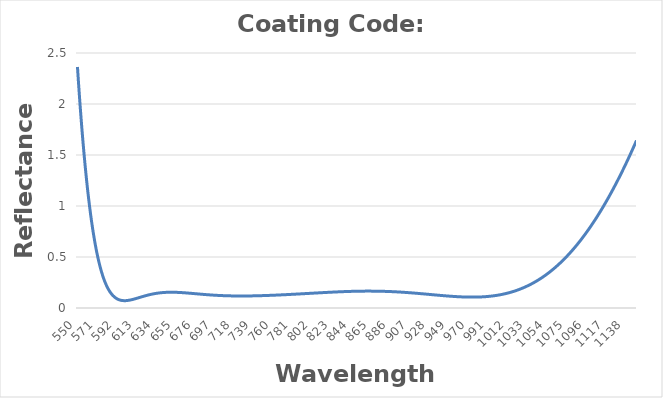
| Category | Reflectance |
|---|---|
| 550.0 | 2.363 |
| 551.0 | 2.225 |
| 552.0 | 2.092 |
| 553.0 | 1.965 |
| 554.0 | 1.845 |
| 555.0 | 1.73 |
| 556.0 | 1.62 |
| 557.0 | 1.516 |
| 558.0 | 1.418 |
| 559.0 | 1.324 |
| 560.0 | 1.235 |
| 561.0 | 1.151 |
| 562.0 | 1.071 |
| 563.0 | 0.996 |
| 564.0 | 0.925 |
| 565.0 | 0.858 |
| 566.0 | 0.795 |
| 567.0 | 0.736 |
| 568.0 | 0.68 |
| 569.0 | 0.628 |
| 570.0 | 0.579 |
| 571.0 | 0.534 |
| 572.0 | 0.491 |
| 573.0 | 0.452 |
| 574.0 | 0.415 |
| 575.0 | 0.38 |
| 576.0 | 0.349 |
| 577.0 | 0.319 |
| 578.0 | 0.292 |
| 579.0 | 0.267 |
| 580.0 | 0.244 |
| 581.0 | 0.223 |
| 582.0 | 0.204 |
| 583.0 | 0.187 |
| 584.0 | 0.171 |
| 585.0 | 0.157 |
| 586.0 | 0.144 |
| 587.0 | 0.132 |
| 588.0 | 0.122 |
| 589.0 | 0.113 |
| 590.0 | 0.105 |
| 591.0 | 0.098 |
| 592.0 | 0.092 |
| 593.0 | 0.087 |
| 594.0 | 0.083 |
| 595.0 | 0.08 |
| 596.0 | 0.077 |
| 597.0 | 0.075 |
| 598.0 | 0.073 |
| 599.0 | 0.072 |
| 600.0 | 0.072 |
| 601.0 | 0.072 |
| 602.0 | 0.072 |
| 603.0 | 0.073 |
| 604.0 | 0.074 |
| 605.0 | 0.075 |
| 606.0 | 0.077 |
| 607.0 | 0.079 |
| 608.0 | 0.081 |
| 609.0 | 0.083 |
| 610.0 | 0.086 |
| 611.0 | 0.088 |
| 612.0 | 0.091 |
| 613.0 | 0.093 |
| 614.0 | 0.096 |
| 615.0 | 0.099 |
| 616.0 | 0.101 |
| 617.0 | 0.104 |
| 618.0 | 0.107 |
| 619.0 | 0.11 |
| 620.0 | 0.112 |
| 621.0 | 0.115 |
| 622.0 | 0.118 |
| 623.0 | 0.12 |
| 624.0 | 0.123 |
| 625.0 | 0.125 |
| 626.0 | 0.128 |
| 627.0 | 0.13 |
| 628.0 | 0.132 |
| 629.0 | 0.134 |
| 630.0 | 0.136 |
| 631.0 | 0.138 |
| 632.0 | 0.14 |
| 633.0 | 0.141 |
| 634.0 | 0.143 |
| 635.0 | 0.144 |
| 636.0 | 0.146 |
| 637.0 | 0.147 |
| 638.0 | 0.148 |
| 639.0 | 0.149 |
| 640.0 | 0.15 |
| 641.0 | 0.151 |
| 642.0 | 0.152 |
| 643.0 | 0.152 |
| 644.0 | 0.153 |
| 645.0 | 0.153 |
| 646.0 | 0.154 |
| 647.0 | 0.154 |
| 648.0 | 0.154 |
| 649.0 | 0.154 |
| 650.0 | 0.154 |
| 651.0 | 0.154 |
| 652.0 | 0.154 |
| 653.0 | 0.154 |
| 654.0 | 0.154 |
| 655.0 | 0.154 |
| 656.0 | 0.154 |
| 657.0 | 0.153 |
| 658.0 | 0.153 |
| 659.0 | 0.152 |
| 660.0 | 0.152 |
| 661.0 | 0.151 |
| 662.0 | 0.151 |
| 663.0 | 0.15 |
| 664.0 | 0.15 |
| 665.0 | 0.149 |
| 666.0 | 0.148 |
| 667.0 | 0.148 |
| 668.0 | 0.147 |
| 669.0 | 0.146 |
| 670.0 | 0.145 |
| 671.0 | 0.145 |
| 672.0 | 0.144 |
| 673.0 | 0.143 |
| 674.0 | 0.142 |
| 675.0 | 0.141 |
| 676.0 | 0.141 |
| 677.0 | 0.14 |
| 678.0 | 0.139 |
| 679.0 | 0.138 |
| 680.0 | 0.137 |
| 681.0 | 0.137 |
| 682.0 | 0.136 |
| 683.0 | 0.135 |
| 684.0 | 0.134 |
| 685.0 | 0.134 |
| 686.0 | 0.133 |
| 687.0 | 0.132 |
| 688.0 | 0.131 |
| 689.0 | 0.131 |
| 690.0 | 0.13 |
| 691.0 | 0.129 |
| 692.0 | 0.128 |
| 693.0 | 0.128 |
| 694.0 | 0.127 |
| 695.0 | 0.127 |
| 696.0 | 0.126 |
| 697.0 | 0.126 |
| 698.0 | 0.125 |
| 699.0 | 0.124 |
| 700.0 | 0.124 |
| 701.0 | 0.123 |
| 702.0 | 0.123 |
| 703.0 | 0.122 |
| 704.0 | 0.122 |
| 705.0 | 0.122 |
| 706.0 | 0.121 |
| 707.0 | 0.121 |
| 708.0 | 0.121 |
| 709.0 | 0.12 |
| 710.0 | 0.12 |
| 711.0 | 0.12 |
| 712.0 | 0.12 |
| 713.0 | 0.119 |
| 714.0 | 0.119 |
| 715.0 | 0.119 |
| 716.0 | 0.119 |
| 717.0 | 0.118 |
| 718.0 | 0.118 |
| 719.0 | 0.118 |
| 720.0 | 0.118 |
| 721.0 | 0.118 |
| 722.0 | 0.118 |
| 723.0 | 0.118 |
| 724.0 | 0.118 |
| 725.0 | 0.118 |
| 726.0 | 0.118 |
| 727.0 | 0.118 |
| 728.0 | 0.118 |
| 729.0 | 0.118 |
| 730.0 | 0.118 |
| 731.0 | 0.118 |
| 732.0 | 0.118 |
| 733.0 | 0.118 |
| 734.0 | 0.118 |
| 735.0 | 0.118 |
| 736.0 | 0.119 |
| 737.0 | 0.119 |
| 738.0 | 0.119 |
| 739.0 | 0.119 |
| 740.0 | 0.119 |
| 741.0 | 0.12 |
| 742.0 | 0.12 |
| 743.0 | 0.12 |
| 744.0 | 0.12 |
| 745.0 | 0.12 |
| 746.0 | 0.121 |
| 747.0 | 0.121 |
| 748.0 | 0.121 |
| 749.0 | 0.122 |
| 750.0 | 0.122 |
| 751.0 | 0.122 |
| 752.0 | 0.122 |
| 753.0 | 0.123 |
| 754.0 | 0.123 |
| 755.0 | 0.123 |
| 756.0 | 0.124 |
| 757.0 | 0.124 |
| 758.0 | 0.124 |
| 759.0 | 0.125 |
| 760.0 | 0.125 |
| 761.0 | 0.126 |
| 762.0 | 0.126 |
| 763.0 | 0.126 |
| 764.0 | 0.127 |
| 765.0 | 0.127 |
| 766.0 | 0.128 |
| 767.0 | 0.128 |
| 768.0 | 0.128 |
| 769.0 | 0.129 |
| 770.0 | 0.129 |
| 771.0 | 0.13 |
| 772.0 | 0.13 |
| 773.0 | 0.131 |
| 774.0 | 0.131 |
| 775.0 | 0.132 |
| 776.0 | 0.132 |
| 777.0 | 0.132 |
| 778.0 | 0.133 |
| 779.0 | 0.133 |
| 780.0 | 0.134 |
| 781.0 | 0.134 |
| 782.0 | 0.135 |
| 783.0 | 0.135 |
| 784.0 | 0.136 |
| 785.0 | 0.136 |
| 786.0 | 0.137 |
| 787.0 | 0.137 |
| 788.0 | 0.138 |
| 789.0 | 0.138 |
| 790.0 | 0.139 |
| 791.0 | 0.139 |
| 792.0 | 0.14 |
| 793.0 | 0.14 |
| 794.0 | 0.141 |
| 795.0 | 0.141 |
| 796.0 | 0.142 |
| 797.0 | 0.142 |
| 798.0 | 0.143 |
| 799.0 | 0.143 |
| 800.0 | 0.144 |
| 801.0 | 0.144 |
| 802.0 | 0.145 |
| 803.0 | 0.146 |
| 804.0 | 0.146 |
| 805.0 | 0.146 |
| 806.0 | 0.147 |
| 807.0 | 0.148 |
| 808.0 | 0.148 |
| 809.0 | 0.149 |
| 810.0 | 0.149 |
| 811.0 | 0.15 |
| 812.0 | 0.15 |
| 813.0 | 0.151 |
| 814.0 | 0.151 |
| 815.0 | 0.152 |
| 816.0 | 0.152 |
| 817.0 | 0.152 |
| 818.0 | 0.153 |
| 819.0 | 0.154 |
| 820.0 | 0.154 |
| 821.0 | 0.154 |
| 822.0 | 0.155 |
| 823.0 | 0.155 |
| 824.0 | 0.156 |
| 825.0 | 0.156 |
| 826.0 | 0.157 |
| 827.0 | 0.157 |
| 828.0 | 0.158 |
| 829.0 | 0.158 |
| 830.0 | 0.158 |
| 831.0 | 0.159 |
| 832.0 | 0.159 |
| 833.0 | 0.16 |
| 834.0 | 0.16 |
| 835.0 | 0.16 |
| 836.0 | 0.161 |
| 837.0 | 0.161 |
| 838.0 | 0.161 |
| 839.0 | 0.162 |
| 840.0 | 0.162 |
| 841.0 | 0.162 |
| 842.0 | 0.162 |
| 843.0 | 0.163 |
| 844.0 | 0.163 |
| 845.0 | 0.163 |
| 846.0 | 0.164 |
| 847.0 | 0.164 |
| 848.0 | 0.164 |
| 849.0 | 0.164 |
| 850.0 | 0.164 |
| 851.0 | 0.164 |
| 852.0 | 0.165 |
| 853.0 | 0.165 |
| 854.0 | 0.165 |
| 855.0 | 0.165 |
| 856.0 | 0.165 |
| 857.0 | 0.165 |
| 858.0 | 0.165 |
| 859.0 | 0.165 |
| 860.0 | 0.166 |
| 861.0 | 0.166 |
| 862.0 | 0.166 |
| 863.0 | 0.166 |
| 864.0 | 0.166 |
| 865.0 | 0.166 |
| 866.0 | 0.165 |
| 867.0 | 0.165 |
| 868.0 | 0.165 |
| 869.0 | 0.165 |
| 870.0 | 0.165 |
| 871.0 | 0.165 |
| 872.0 | 0.165 |
| 873.0 | 0.165 |
| 874.0 | 0.164 |
| 875.0 | 0.164 |
| 876.0 | 0.164 |
| 877.0 | 0.164 |
| 878.0 | 0.164 |
| 879.0 | 0.163 |
| 880.0 | 0.163 |
| 881.0 | 0.163 |
| 882.0 | 0.162 |
| 883.0 | 0.162 |
| 884.0 | 0.162 |
| 885.0 | 0.161 |
| 886.0 | 0.161 |
| 887.0 | 0.161 |
| 888.0 | 0.16 |
| 889.0 | 0.16 |
| 890.0 | 0.159 |
| 891.0 | 0.159 |
| 892.0 | 0.158 |
| 893.0 | 0.158 |
| 894.0 | 0.157 |
| 895.0 | 0.157 |
| 896.0 | 0.156 |
| 897.0 | 0.156 |
| 898.0 | 0.155 |
| 899.0 | 0.155 |
| 900.0 | 0.154 |
| 901.0 | 0.153 |
| 902.0 | 0.153 |
| 903.0 | 0.152 |
| 904.0 | 0.151 |
| 905.0 | 0.151 |
| 906.0 | 0.15 |
| 907.0 | 0.149 |
| 908.0 | 0.149 |
| 909.0 | 0.148 |
| 910.0 | 0.147 |
| 911.0 | 0.146 |
| 912.0 | 0.146 |
| 913.0 | 0.145 |
| 914.0 | 0.144 |
| 915.0 | 0.144 |
| 916.0 | 0.143 |
| 917.0 | 0.142 |
| 918.0 | 0.141 |
| 919.0 | 0.14 |
| 920.0 | 0.14 |
| 921.0 | 0.139 |
| 922.0 | 0.138 |
| 923.0 | 0.137 |
| 924.0 | 0.136 |
| 925.0 | 0.135 |
| 926.0 | 0.135 |
| 927.0 | 0.134 |
| 928.0 | 0.133 |
| 929.0 | 0.132 |
| 930.0 | 0.131 |
| 931.0 | 0.13 |
| 932.0 | 0.13 |
| 933.0 | 0.129 |
| 934.0 | 0.128 |
| 935.0 | 0.127 |
| 936.0 | 0.126 |
| 937.0 | 0.126 |
| 938.0 | 0.125 |
| 939.0 | 0.124 |
| 940.0 | 0.123 |
| 941.0 | 0.122 |
| 942.0 | 0.122 |
| 943.0 | 0.121 |
| 944.0 | 0.12 |
| 945.0 | 0.119 |
| 946.0 | 0.118 |
| 947.0 | 0.118 |
| 948.0 | 0.117 |
| 949.0 | 0.116 |
| 950.0 | 0.116 |
| 951.0 | 0.115 |
| 952.0 | 0.114 |
| 953.0 | 0.114 |
| 954.0 | 0.113 |
| 955.0 | 0.113 |
| 956.0 | 0.112 |
| 957.0 | 0.111 |
| 958.0 | 0.111 |
| 959.0 | 0.11 |
| 960.0 | 0.11 |
| 961.0 | 0.11 |
| 962.0 | 0.109 |
| 963.0 | 0.109 |
| 964.0 | 0.108 |
| 965.0 | 0.108 |
| 966.0 | 0.108 |
| 967.0 | 0.108 |
| 968.0 | 0.107 |
| 969.0 | 0.107 |
| 970.0 | 0.107 |
| 971.0 | 0.107 |
| 972.0 | 0.107 |
| 973.0 | 0.107 |
| 974.0 | 0.107 |
| 975.0 | 0.107 |
| 976.0 | 0.107 |
| 977.0 | 0.107 |
| 978.0 | 0.107 |
| 979.0 | 0.107 |
| 980.0 | 0.108 |
| 981.0 | 0.108 |
| 982.0 | 0.108 |
| 983.0 | 0.108 |
| 984.0 | 0.109 |
| 985.0 | 0.11 |
| 986.0 | 0.11 |
| 987.0 | 0.111 |
| 988.0 | 0.111 |
| 989.0 | 0.112 |
| 990.0 | 0.113 |
| 991.0 | 0.114 |
| 992.0 | 0.115 |
| 993.0 | 0.116 |
| 994.0 | 0.117 |
| 995.0 | 0.118 |
| 996.0 | 0.119 |
| 997.0 | 0.12 |
| 998.0 | 0.121 |
| 999.0 | 0.123 |
| 1000.0 | 0.124 |
| 1001.0 | 0.126 |
| 1002.0 | 0.127 |
| 1003.0 | 0.129 |
| 1004.0 | 0.13 |
| 1005.0 | 0.132 |
| 1006.0 | 0.134 |
| 1007.0 | 0.136 |
| 1008.0 | 0.138 |
| 1009.0 | 0.14 |
| 1010.0 | 0.142 |
| 1011.0 | 0.144 |
| 1012.0 | 0.147 |
| 1013.0 | 0.149 |
| 1014.0 | 0.152 |
| 1015.0 | 0.154 |
| 1016.0 | 0.157 |
| 1017.0 | 0.16 |
| 1018.0 | 0.163 |
| 1019.0 | 0.166 |
| 1020.0 | 0.169 |
| 1021.0 | 0.172 |
| 1022.0 | 0.175 |
| 1023.0 | 0.178 |
| 1024.0 | 0.182 |
| 1025.0 | 0.185 |
| 1026.0 | 0.189 |
| 1027.0 | 0.192 |
| 1028.0 | 0.196 |
| 1029.0 | 0.2 |
| 1030.0 | 0.204 |
| 1031.0 | 0.208 |
| 1032.0 | 0.212 |
| 1033.0 | 0.217 |
| 1034.0 | 0.221 |
| 1035.0 | 0.226 |
| 1036.0 | 0.23 |
| 1037.0 | 0.235 |
| 1038.0 | 0.24 |
| 1039.0 | 0.245 |
| 1040.0 | 0.25 |
| 1041.0 | 0.255 |
| 1042.0 | 0.26 |
| 1043.0 | 0.266 |
| 1044.0 | 0.271 |
| 1045.0 | 0.277 |
| 1046.0 | 0.283 |
| 1047.0 | 0.289 |
| 1048.0 | 0.295 |
| 1049.0 | 0.301 |
| 1050.0 | 0.307 |
| 1051.0 | 0.313 |
| 1052.0 | 0.32 |
| 1053.0 | 0.326 |
| 1054.0 | 0.333 |
| 1055.0 | 0.34 |
| 1056.0 | 0.347 |
| 1057.0 | 0.354 |
| 1058.0 | 0.361 |
| 1059.0 | 0.369 |
| 1060.0 | 0.376 |
| 1061.0 | 0.384 |
| 1062.0 | 0.392 |
| 1063.0 | 0.4 |
| 1064.0 | 0.408 |
| 1065.0 | 0.416 |
| 1066.0 | 0.424 |
| 1067.0 | 0.432 |
| 1068.0 | 0.441 |
| 1069.0 | 0.45 |
| 1070.0 | 0.458 |
| 1071.0 | 0.467 |
| 1072.0 | 0.476 |
| 1073.0 | 0.486 |
| 1074.0 | 0.495 |
| 1075.0 | 0.505 |
| 1076.0 | 0.514 |
| 1077.0 | 0.524 |
| 1078.0 | 0.534 |
| 1079.0 | 0.544 |
| 1080.0 | 0.554 |
| 1081.0 | 0.565 |
| 1082.0 | 0.575 |
| 1083.0 | 0.586 |
| 1084.0 | 0.597 |
| 1085.0 | 0.608 |
| 1086.0 | 0.619 |
| 1087.0 | 0.63 |
| 1088.0 | 0.641 |
| 1089.0 | 0.653 |
| 1090.0 | 0.664 |
| 1091.0 | 0.676 |
| 1092.0 | 0.688 |
| 1093.0 | 0.7 |
| 1094.0 | 0.713 |
| 1095.0 | 0.725 |
| 1096.0 | 0.738 |
| 1097.0 | 0.75 |
| 1098.0 | 0.763 |
| 1099.0 | 0.776 |
| 1100.0 | 0.789 |
| 1101.0 | 0.803 |
| 1102.0 | 0.816 |
| 1103.0 | 0.83 |
| 1104.0 | 0.844 |
| 1105.0 | 0.857 |
| 1106.0 | 0.872 |
| 1107.0 | 0.886 |
| 1108.0 | 0.9 |
| 1109.0 | 0.915 |
| 1110.0 | 0.929 |
| 1111.0 | 0.944 |
| 1112.0 | 0.959 |
| 1113.0 | 0.974 |
| 1114.0 | 0.99 |
| 1115.0 | 1.005 |
| 1116.0 | 1.021 |
| 1117.0 | 1.036 |
| 1118.0 | 1.052 |
| 1119.0 | 1.068 |
| 1120.0 | 1.085 |
| 1121.0 | 1.101 |
| 1122.0 | 1.118 |
| 1123.0 | 1.134 |
| 1124.0 | 1.151 |
| 1125.0 | 1.168 |
| 1126.0 | 1.185 |
| 1127.0 | 1.202 |
| 1128.0 | 1.22 |
| 1129.0 | 1.238 |
| 1130.0 | 1.255 |
| 1131.0 | 1.273 |
| 1132.0 | 1.291 |
| 1133.0 | 1.31 |
| 1134.0 | 1.328 |
| 1135.0 | 1.346 |
| 1136.0 | 1.365 |
| 1137.0 | 1.384 |
| 1138.0 | 1.403 |
| 1139.0 | 1.422 |
| 1140.0 | 1.441 |
| 1141.0 | 1.461 |
| 1142.0 | 1.48 |
| 1143.0 | 1.5 |
| 1144.0 | 1.52 |
| 1145.0 | 1.54 |
| 1146.0 | 1.56 |
| 1147.0 | 1.581 |
| 1148.0 | 1.601 |
| 1149.0 | 1.622 |
| 1150.0 | 1.643 |